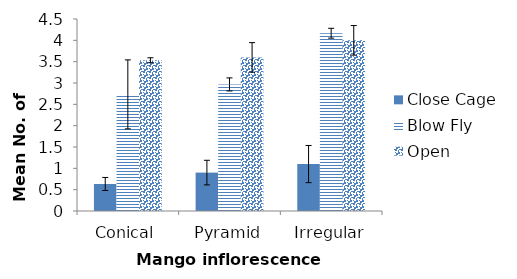
| Category | Close Cage | Blow Fly | Open |
|---|---|---|---|
| Conical | 0.633 | 2.733 | 3.533 |
| Pyramid | 0.9 | 2.967 | 3.6 |
| Irregular | 1.1 | 4.167 | 4 |